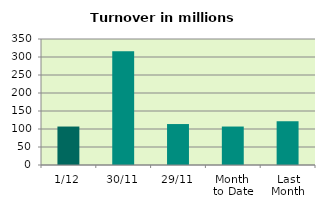
| Category | Series 0 |
|---|---|
| 1/12 | 106.842 |
| 30/11 | 315.643 |
| 29/11 | 113.768 |
| Month 
to Date | 106.842 |
| Last
Month | 121.455 |